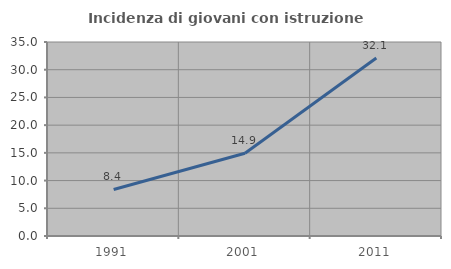
| Category | Incidenza di giovani con istruzione universitaria |
|---|---|
| 1991.0 | 8.392 |
| 2001.0 | 14.918 |
| 2011.0 | 32.129 |